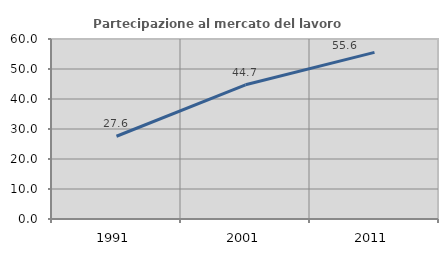
| Category | Partecipazione al mercato del lavoro  femminile |
|---|---|
| 1991.0 | 27.586 |
| 2001.0 | 44.737 |
| 2011.0 | 55.556 |